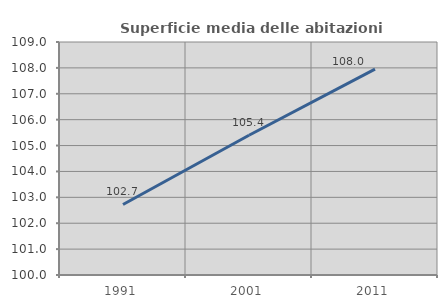
| Category | Superficie media delle abitazioni occupate |
|---|---|
| 1991.0 | 102.725 |
| 2001.0 | 105.397 |
| 2011.0 | 107.953 |